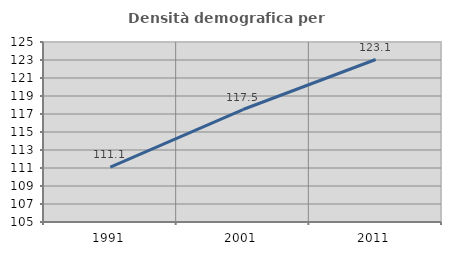
| Category | Densità demografica |
|---|---|
| 1991.0 | 111.087 |
| 2001.0 | 117.498 |
| 2011.0 | 123.054 |